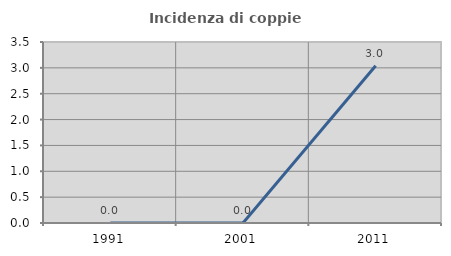
| Category | Incidenza di coppie miste |
|---|---|
| 1991.0 | 0 |
| 2001.0 | 0 |
| 2011.0 | 3.041 |